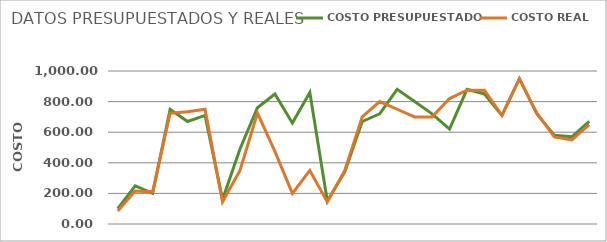
| Category | COSTO PRESUPUESTADO | COSTO REAL |
|---|---|---|
| 0 | 100 | 85 |
| 1 | 250 | 215 |
| 2 | 200 | 210 |
| 3 | 750 | 724 |
| 4 | 670 | 733 |
| 5 | 710 | 750 |
| 6 | 160 | 145 |
| 7 | 490 | 350 |
| 8 | 760 | 725 |
| 9 | 850 | 475 |
| 10 | 660 | 200 |
| 11 | 860 | 350 |
| 12 | 150 | 144 |
| 13 | 340 | 350 |
| 14 | 670 | 700 |
| 15 | 720 | 800 |
| 16 | 880 | 750 |
| 17 | 800 | 700 |
| 18 | 720 | 700 |
| 19 | 620 | 820 |
| 20 | 880 | 875 |
| 21 | 850 | 875 |
| 22 | 710 | 710 |
| 23 | 950 | 949 |
| 24 | 720 | 725 |
| 25 | 580 | 569 |
| 26 | 570 | 550 |
| 27 | 670 | 650 |